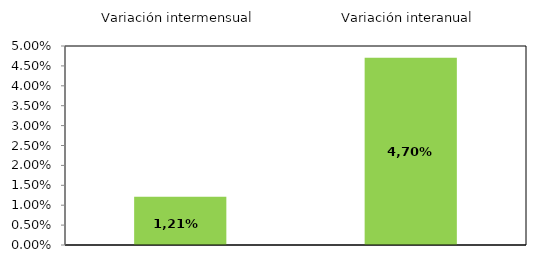
| Category | Series 0 |
|---|---|
| 0 | 1.21 |
| 1 | 4.703 |